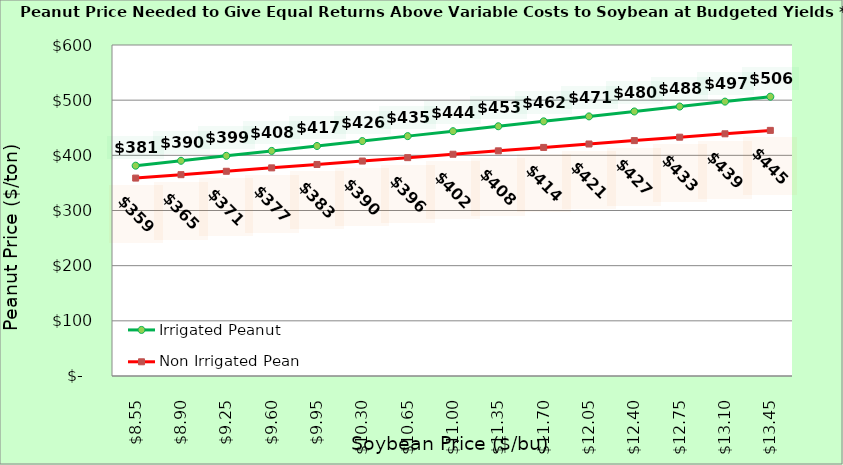
| Category | Irrigated Peanut | Non Irrigated Peanut |
|---|---|---|
| 8.550000000000002 | 381.204 | 358.753 |
| 8.900000000000002 | 390.14 | 364.929 |
| 9.250000000000002 | 399.077 | 371.106 |
| 9.600000000000001 | 408.013 | 377.282 |
| 9.950000000000001 | 416.949 | 383.459 |
| 10.3 | 425.885 | 389.635 |
| 10.65 | 434.821 | 395.812 |
| 11.0 | 443.757 | 401.988 |
| 11.35 | 452.694 | 408.165 |
| 11.7 | 461.63 | 414.341 |
| 12.049999999999999 | 470.566 | 420.518 |
| 12.399999999999999 | 479.502 | 426.694 |
| 12.749999999999998 | 488.438 | 432.871 |
| 13.099999999999998 | 497.374 | 439.047 |
| 13.449999999999998 | 506.311 | 445.224 |